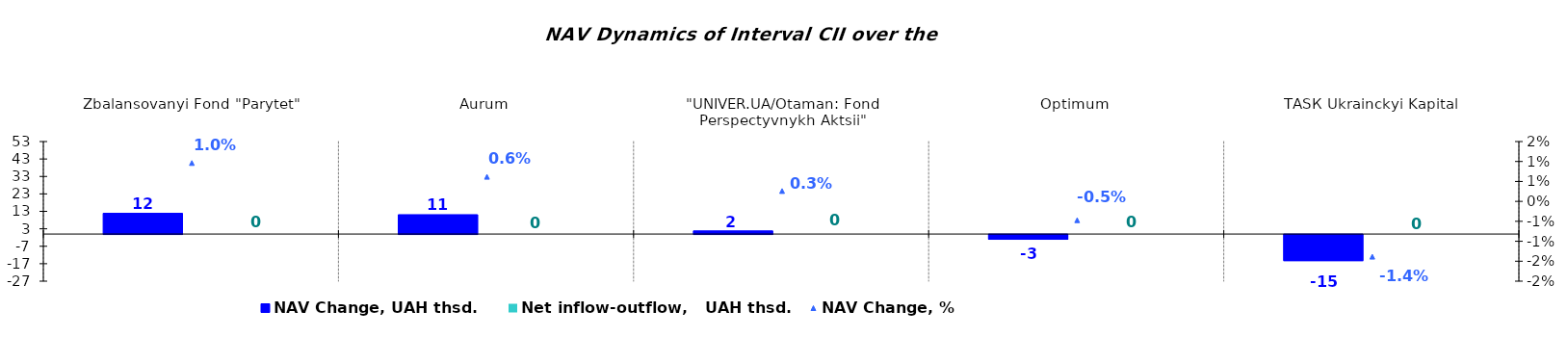
| Category | NAV Change, UAH thsd. | Net inflow-outflow,   UAH thsd. |
|---|---|---|
| Zbalansovanyi Fond "Parytet" | 11.885 | 0 |
| Аurum | 11.088 | 0 |
| "UNIVER.UA/Otaman: Fond Perspectyvnykh Aktsii" | 1.805 | 0 |
| Optimum | -2.733 | 0 |
| ТАSК Ukrainckyi Kapital | -14.954 | 0 |